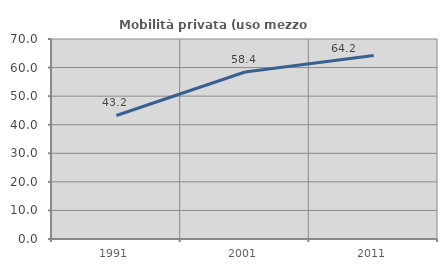
| Category | Mobilità privata (uso mezzo privato) |
|---|---|
| 1991.0 | 43.228 |
| 2001.0 | 58.435 |
| 2011.0 | 64.208 |